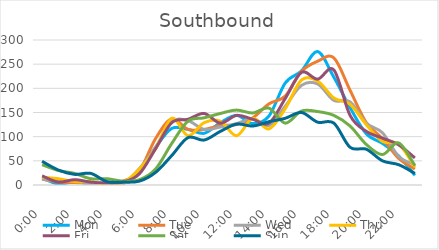
| Category | Mon | Tue | Wed | Thu | Fri | Sat | Sun |
|---|---|---|---|---|---|---|---|
| 0.0 | 15 | 12 | 12 | 16 | 19 | 42 | 49 |
| 0.041667 | 2 | 6 | 8 | 13 | 6 | 30 | 31 |
| 0.083333 | 7 | 5 | 8 | 7 | 11 | 24 | 22 |
| 0.125 | 4 | 4 | 1 | 7 | 6 | 13 | 24 |
| 0.166667 | 1 | 5 | 1 | 1 | 4 | 13 | 7 |
| 0.208333 | 5 | 8 | 2 | 5 | 6 | 8 | 6 |
| 0.25 | 28 | 29 | 34 | 33 | 23 | 11 | 8 |
| 0.291667 | 78 | 96 | 78 | 75 | 75 | 33 | 26 |
| 0.333333 | 117 | 137 | 131 | 138 | 129 | 86 | 61 |
| 0.375 | 115 | 115 | 133 | 102 | 136 | 132 | 98 |
| 0.416667 | 107 | 115 | 115 | 129 | 148 | 139 | 93 |
| 0.458333 | 129 | 123 | 120 | 132 | 128 | 148 | 111 |
| 0.5 | 144 | 125 | 127 | 102 | 144 | 155 | 126 |
| 0.541667 | 127 | 139 | 137 | 138 | 136 | 149 | 122 |
| 0.5833333333333334 | 143 | 168 | 123 | 116 | 128 | 159 | 131 |
| 0.625 | 211 | 184 | 163 | 158 | 179 | 128 | 138 |
| 0.666667 | 236 | 235 | 206 | 217 | 233 | 153 | 150 |
| 0.708333 | 276 | 256 | 209 | 215 | 219 | 152 | 130 |
| 0.75 | 223 | 263 | 175 | 180 | 238 | 144 | 128 |
| 0.791667 | 160 | 196 | 172 | 167 | 144 | 122 | 78 |
| 0.833333 | 106 | 129 | 128 | 125 | 111 | 84 | 74 |
| 0.875 | 86 | 96 | 108 | 90 | 97 | 63 | 50 |
| 0.916667 | 60 | 55 | 59 | 85 | 83 | 87 | 42 |
| 0.958333 | 20 | 33 | 42 | 37 | 56 | 40 | 24 |